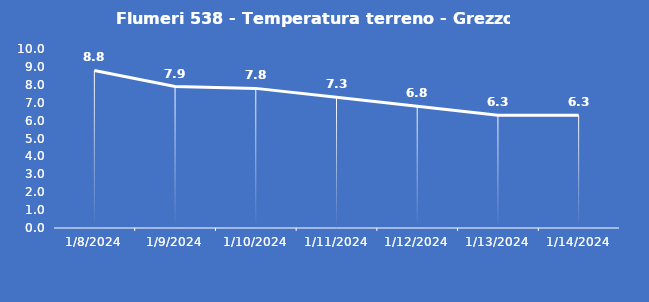
| Category | Flumeri 538 - Temperatura terreno - Grezzo (°C) |
|---|---|
| 1/8/24 | 8.8 |
| 1/9/24 | 7.9 |
| 1/10/24 | 7.8 |
| 1/11/24 | 7.3 |
| 1/12/24 | 6.8 |
| 1/13/24 | 6.3 |
| 1/14/24 | 6.3 |